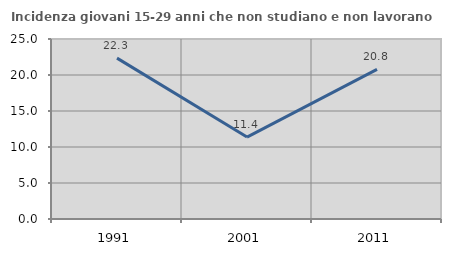
| Category | Incidenza giovani 15-29 anni che non studiano e non lavorano  |
|---|---|
| 1991.0 | 22.34 |
| 2001.0 | 11.382 |
| 2011.0 | 20.779 |